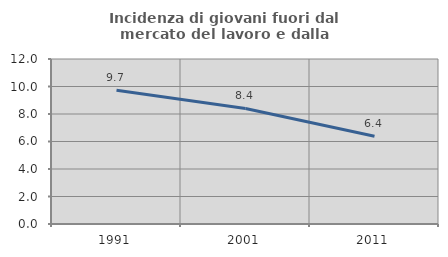
| Category | Incidenza di giovani fuori dal mercato del lavoro e dalla formazione  |
|---|---|
| 1991.0 | 9.732 |
| 2001.0 | 8.403 |
| 2011.0 | 6.388 |